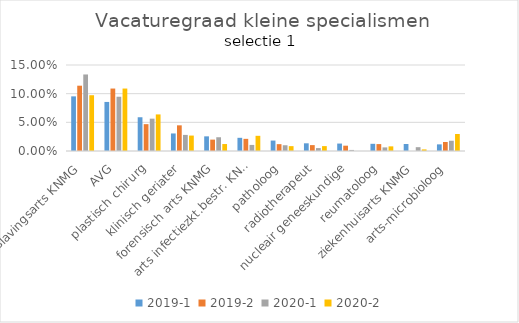
| Category | 2019-1 | 2019-2 | 2020-1 | 2020-2 |
|---|---|---|---|---|
| verslavingsarts KNMG | 0.095 | 0.114 | 0.133 | 0.097 |
| AVG | 0.086 | 0.109 | 0.095 | 0.109 |
| plastisch chirurg | 0.059 | 0.047 | 0.056 | 0.064 |
| klinisch geriater | 0.031 | 0.045 | 0.028 | 0.027 |
| forensisch arts KNMG | 0.026 | 0.02 | 0.024 | 0.012 |
| arts infectiezkt.bestr. KNMG | 0.023 | 0.021 | 0.011 | 0.026 |
| patholoog | 0.018 | 0.012 | 0.01 | 0.008 |
| radiotherapeut | 0.013 | 0.01 | 0.005 | 0.009 |
| nucleair geneeskundige | 0.013 | 0.009 | 0.002 | 0 |
| reumatoloog | 0.013 | 0.012 | 0.006 | 0.008 |
| ziekenhuisarts KNMG | 0.012 | 0 | 0.007 | 0.003 |
| arts-microbioloog | 0.012 | 0.016 | 0.018 | 0.03 |